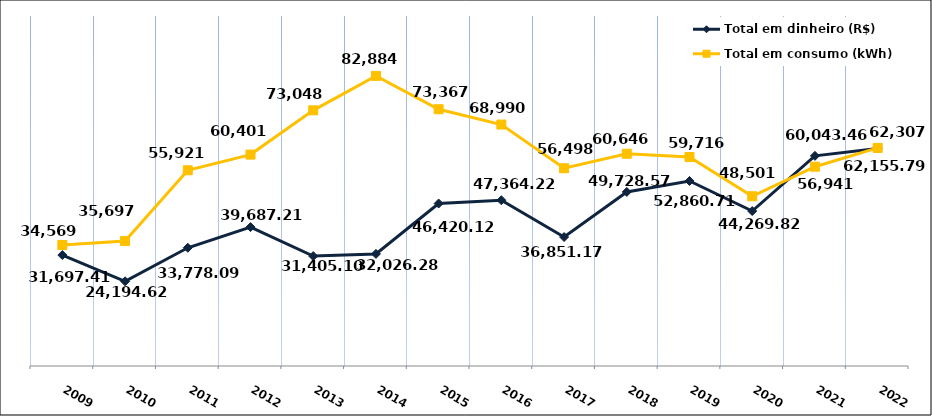
| Category | Total em dinheiro (R$) |
|---|---|
| 2009.0 | 31697.41 |
| 2010.0 | 24194.62 |
| 2011.0 | 33778.09 |
| 2012.0 | 39687.21 |
| 2013.0 | 31405.1 |
| 2014.0 | 32026.28 |
| 2015.0 | 46420.12 |
| 2016.0 | 47364.22 |
| 2017.0 | 36851.17 |
| 2018.0 | 49728.57 |
| 2019.0 | 52860.71 |
| 2020.0 | 44269.82 |
| 2021.0 | 60043.46 |
| 2022.0 | 62155.79 |